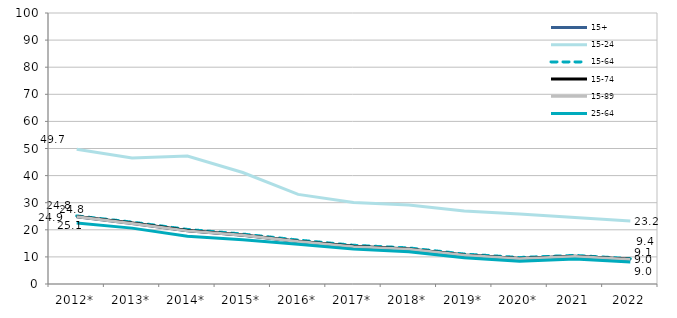
| Category | 15+ | 15-24 | 15-64 | 15-74 | 15-89 | 25-64 |
|---|---|---|---|---|---|---|
| 2012* | 24.796 | 49.703 | 25.135 | 24.895 | 24.796 | 22.487 |
| 2013* | 22.29 | 46.473 | 22.849 | 22.492 | 22.29 | 20.621 |
| 2014* | 19.604 | 47.215 | 20.138 | 19.724 | 19.604 | 17.601 |
| 2015* | 17.994 | 41.141 | 18.434 | 18.06 | 17.994 | 16.343 |
| 2016* | 15.651 | 33.071 | 16.217 | 15.788 | 15.651 | 14.662 |
| 2017* | 13.792 | 30.035 | 14.292 | 13.924 | 13.792 | 12.868 |
| 2018* | 12.829 | 29.158 | 13.318 | 12.941 | 12.829 | 11.942 |
| 2019* | 10.588 | 26.909 | 11.064 | 10.709 | 10.588 | 9.692 |
| 2020* | 9.363 | 25.792 | 9.784 | 9.455 | 9.363 | 8.44 |
| 2021 | 10.16 | 24.582 | 10.561 | 10.217 | 10.16 | 9.246 |
| 2022 | 9.034 | 23.234 | 9.353 | 9.093 | 9.034 | 8.127 |